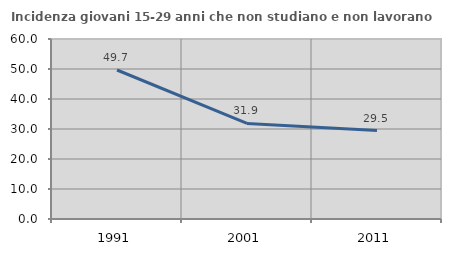
| Category | Incidenza giovani 15-29 anni che non studiano e non lavorano  |
|---|---|
| 1991.0 | 49.669 |
| 2001.0 | 31.87 |
| 2011.0 | 29.499 |